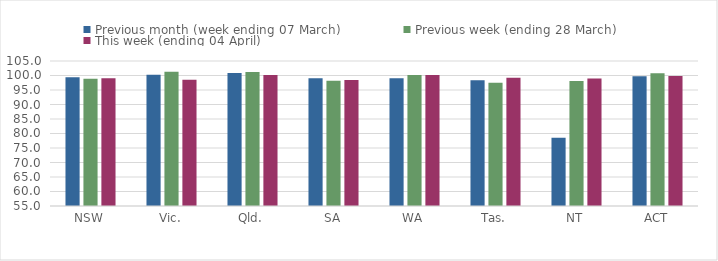
| Category | Previous month (week ending 07 March) | Previous week (ending 28 March) | This week (ending 04 April) |
|---|---|---|---|
| NSW | 99.397 | 98.888 | 99.024 |
| Vic. | 100.295 | 101.256 | 98.494 |
| Qld. | 100.902 | 101.214 | 100.186 |
| SA | 99.081 | 98.232 | 98.444 |
| WA | 99.079 | 100.195 | 100.162 |
| Tas. | 98.354 | 97.46 | 99.249 |
| NT | 78.526 | 98.105 | 98.947 |
| ACT | 99.711 | 100.771 | 99.807 |